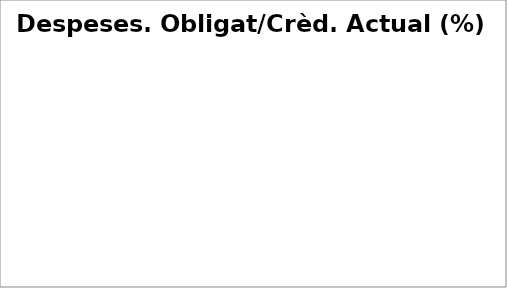
| Category | Series 0 |
|---|---|
| Despeses de personal | 0.389 |
| Despeses en béns corrents i serveis | 0.245 |
| Despeses financeres | 0.114 |
| Transferències corrents | 0.396 |
| Fons de contingència | 0 |
| Inversions reals | 0.152 |
| Transferències de capital | 0.022 |
| Actius financers | 0.347 |
| Passius financers | 0.704 |